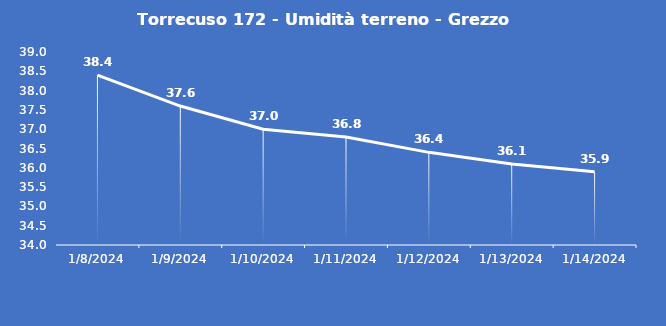
| Category | Torrecuso 172 - Umidità terreno - Grezzo (%VWC) |
|---|---|
| 1/8/24 | 38.4 |
| 1/9/24 | 37.6 |
| 1/10/24 | 37 |
| 1/11/24 | 36.8 |
| 1/12/24 | 36.4 |
| 1/13/24 | 36.1 |
| 1/14/24 | 35.9 |